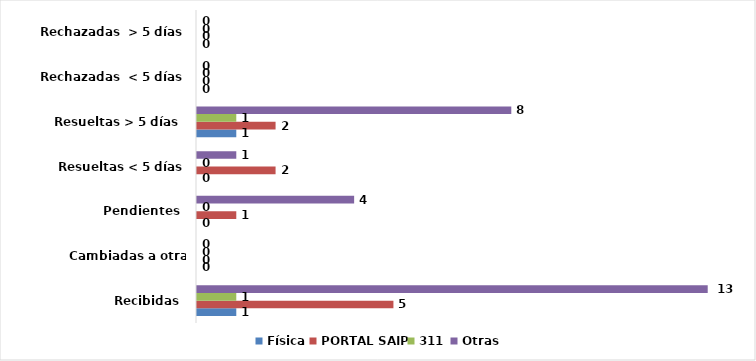
| Category | Física | PORTAL SAIP | 311 | Otras |
|---|---|---|---|---|
| Recibidas  | 1 | 5 | 1 | 13 |
| Cambiadas a otra institución | 0 | 0 | 0 | 0 |
| Pendientes  | 0 | 1 | 0 | 4 |
| Resueltas < 5 días | 0 | 2 | 0 | 1 |
| Resueltas > 5 días  | 1 | 2 | 1 | 8 |
| Rechazadas  < 5 días | 0 | 0 | 0 | 0 |
| Rechazadas  > 5 días | 0 | 0 | 0 | 0 |